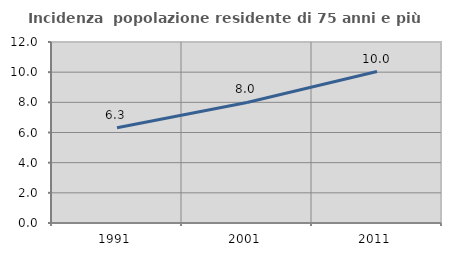
| Category | Incidenza  popolazione residente di 75 anni e più |
|---|---|
| 1991.0 | 6.317 |
| 2001.0 | 7.993 |
| 2011.0 | 10.043 |